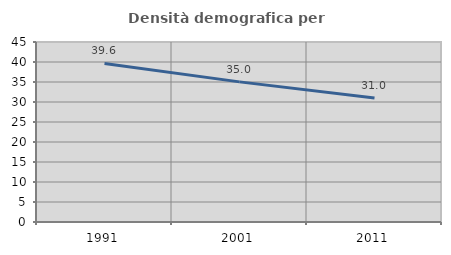
| Category | Densità demografica |
|---|---|
| 1991.0 | 39.636 |
| 2001.0 | 35.032 |
| 2011.0 | 31.029 |